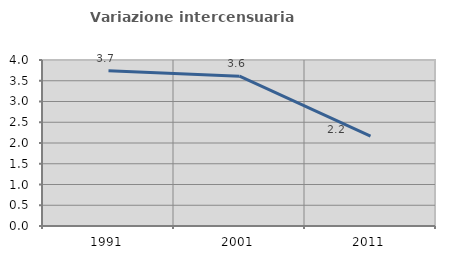
| Category | Variazione intercensuaria annua |
|---|---|
| 1991.0 | 3.738 |
| 2001.0 | 3.611 |
| 2011.0 | 2.164 |